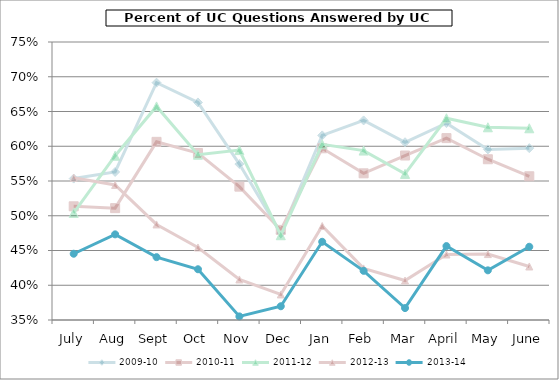
| Category | 2009-10 | 2010-11 | 2011-12 | 2012-13 | 2013-14 |
|---|---|---|---|---|---|
| July | 0.553 | 0.514 | 0.504 | 0.555 | 0.445 |
| Aug | 0.563 | 0.511 | 0.586 | 0.544 | 0.473 |
| Sept | 0.691 | 0.606 | 0.657 | 0.487 | 0.44 |
| Oct | 0.663 | 0.59 | 0.588 | 0.454 | 0.423 |
| Nov | 0.574 | 0.542 | 0.594 | 0.408 | 0.355 |
| Dec | 0.475 | 0.48 | 0.472 | 0.387 | 0.37 |
| Jan | 0.616 | 0.597 | 0.603 | 0.485 | 0.463 |
| Feb | 0.637 | 0.561 | 0.594 | 0.424 | 0.421 |
| Mar | 0.606 | 0.587 | 0.56 | 0.407 | 0.367 |
| April | 0.633 | 0.612 | 0.64 | 0.444 | 0.456 |
| May | 0.595 | 0.581 | 0.627 | 0.445 | 0.421 |
| June | 0.597 | 0.557 | 0.626 | 0.427 | 0.455 |